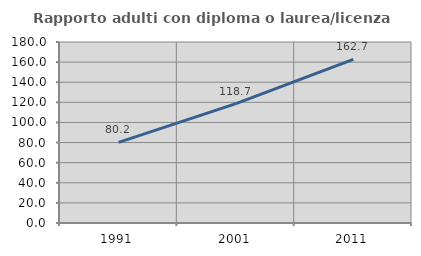
| Category | Rapporto adulti con diploma o laurea/licenza media  |
|---|---|
| 1991.0 | 80.201 |
| 2001.0 | 118.652 |
| 2011.0 | 162.656 |